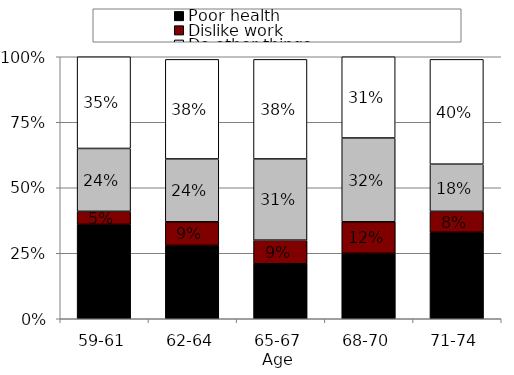
| Category | Poor health | Dislike work | Do other things | Spend time with family |
|---|---|---|---|---|
| 59-61 | 0.36 | 0.05 | 0.24 | 0.35 |
| 62-64 | 0.28 | 0.09 | 0.24 | 0.38 |
| 65-67 | 0.21 | 0.09 | 0.31 | 0.38 |
| 68-70 | 0.25 | 0.12 | 0.32 | 0.31 |
| 71-74 | 0.33 | 0.08 | 0.18 | 0.4 |